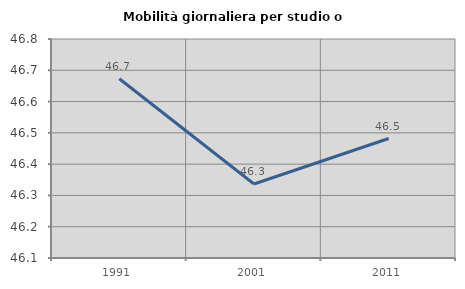
| Category | Mobilità giornaliera per studio o lavoro |
|---|---|
| 1991.0 | 46.673 |
| 2001.0 | 46.336 |
| 2011.0 | 46.482 |